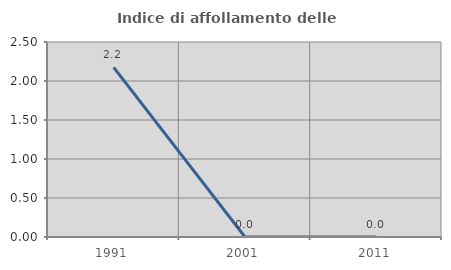
| Category | Indice di affollamento delle abitazioni  |
|---|---|
| 1991.0 | 2.174 |
| 2001.0 | 0 |
| 2011.0 | 0 |